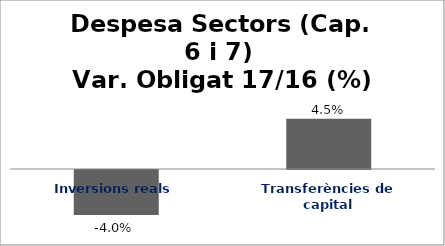
| Category | Series 0 |
|---|---|
| Inversions reals | -0.04 |
| Transferències de capital | 0.045 |